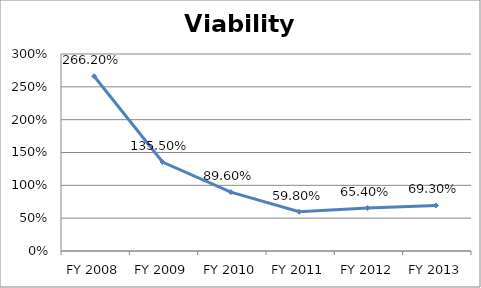
| Category | Viability ratio |
|---|---|
| FY 2013 | 0.693 |
| FY 2012 | 0.654 |
| FY 2011 | 0.598 |
| FY 2010 | 0.896 |
| FY 2009 | 1.355 |
| FY 2008 | 2.662 |